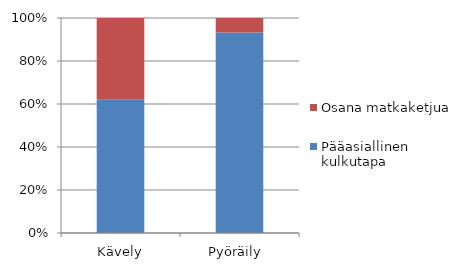
| Category | Pääasiallinen kulkutapa | Osana matkaketjua |
|---|---|---|
| Kävely | 13025 | 7982 |
| Pyöräily  | 3386 | 245 |